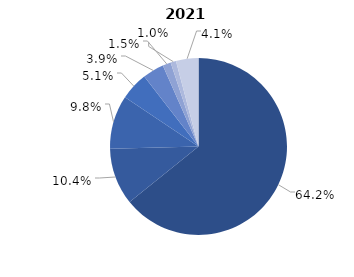
| Category | Series 0 |
|---|---|
| Circulaţia rutieră | 0.642 |
| Sănătatea populaţiei, sănătatea persoanei, starea sanitar-epidemiologică | 0.104 |
| Ordinea publică şi securitatea publică | 0.098 |
| Activitatea de întreprinzător, fiscalitatea, activitatea vamală şi valorile mobiliare | 0.051 |
| Drepturile politice, de muncă şi alte drepturi constituţionale ale persoanei fizice  | 0.039 |
| Drepturile reale | 0.015 |
| Protecţia mediului | 0.01 |
| Altele | 0.041 |